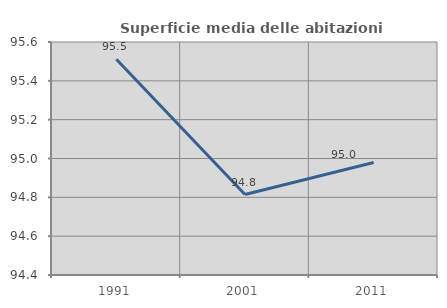
| Category | Superficie media delle abitazioni occupate |
|---|---|
| 1991.0 | 95.512 |
| 2001.0 | 94.814 |
| 2011.0 | 94.979 |